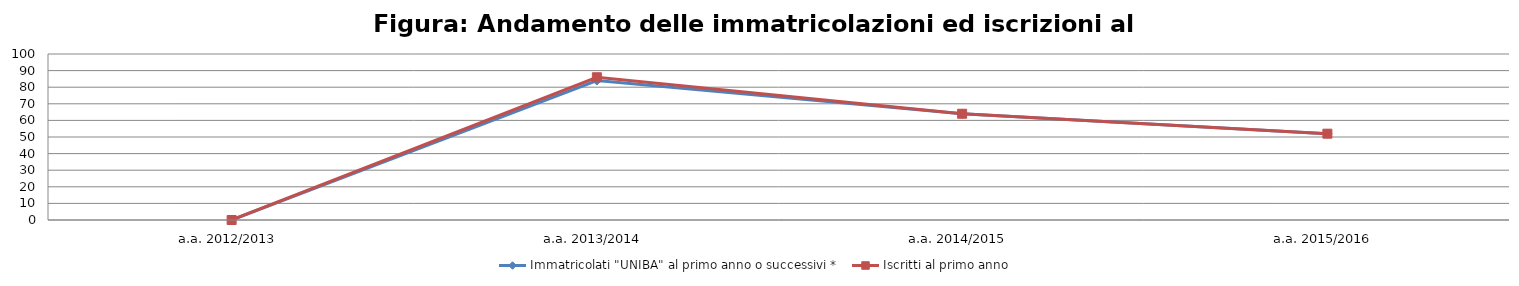
| Category | Immatricolati "UNIBA" al primo anno o successivi * | Iscritti al primo anno  |
|---|---|---|
| a.a. 2012/2013 | 0 | 0 |
| a.a. 2013/2014 | 84 | 86 |
| a.a. 2014/2015 | 64 | 64 |
| a.a. 2015/2016 | 52 | 52 |